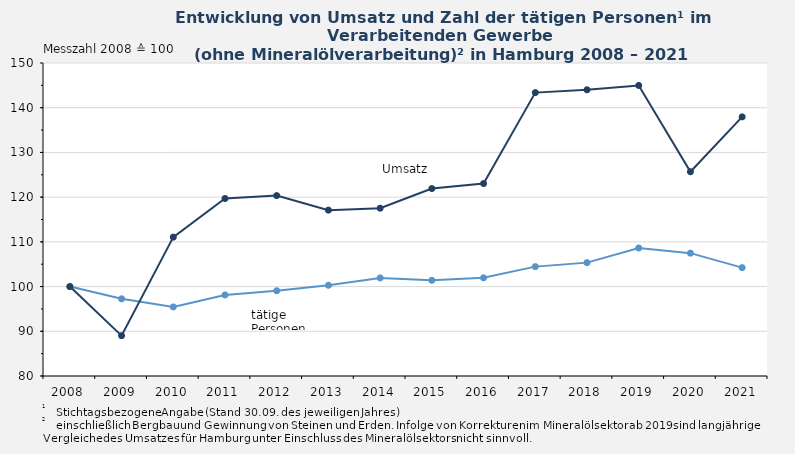
| Category | tätige Personen | Umsatz in 1000 Euro |
|---|---|---|
| 2008.0 | 100 | 100 |
| 2009.0 | 97.265 | 89.021 |
| 2010.0 | 95.447 | 111.053 |
| 2011.0 | 98.132 | 119.695 |
| 2012.0 | 99.072 | 120.348 |
| 2013.0 | 100.289 | 117.095 |
| 2014.0 | 101.934 | 117.523 |
| 2015.0 | 101.399 | 121.925 |
| 2016.0 | 101.964 | 123.035 |
| 2017.0 | 104.461 | 143.381 |
| 2018.0 | 105.354 | 144.013 |
| 2019.0 | 108.628 | 144.978 |
| 2020.0 | 107.476 | 125.683 |
| 2021.0 | 104.233 | 137.955 |